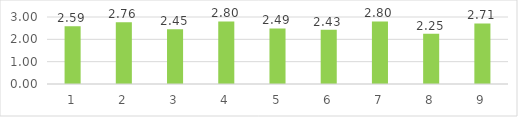
| Category | Series 0 |
|---|---|
| 0 | 2.59 |
| 1 | 2.76 |
| 2 | 2.45 |
| 3 | 2.8 |
| 4 | 2.49 |
| 5 | 2.43 |
| 6 | 2.8 |
| 7 | 2.25 |
| 8 | 2.71 |